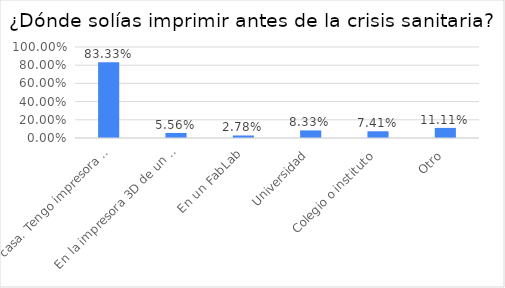
| Category | Series 0 |
|---|---|
| En casa. Tengo impresora 3D | 0.833 |
| En la impresora 3D de un amigo o conocido | 0.056 |
| En un FabLab | 0.028 |
| Universidad | 0.083 |
| Colegio o instituto | 0.074 |
| Otro | 0.111 |